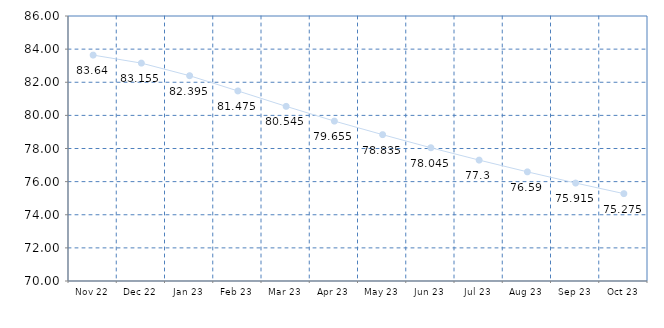
| Category | Series 0 |
|---|---|
| Nov 22 | 83.64 |
| Dec 22 | 83.155 |
| Jan 23 | 82.395 |
| Feb 23 | 81.475 |
| Mar 23 | 80.545 |
| Apr 23 | 79.655 |
| May 23 | 78.835 |
| Jun 23 | 78.045 |
| Jul 23 | 77.3 |
| Aug 23 | 76.59 |
| Sep 23 | 75.915 |
| Oct 23 | 75.275 |